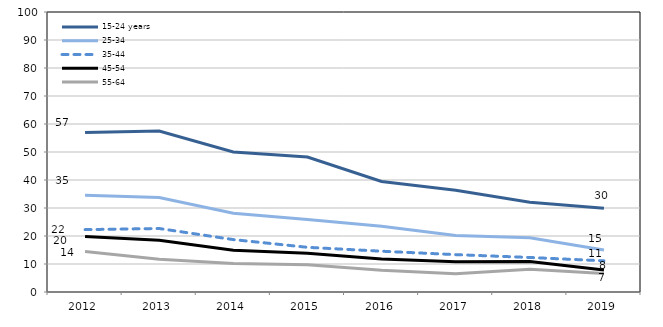
| Category | 15-24 years | 25-34  | 35-44  | 45-54  | 55-64  |
|---|---|---|---|---|---|
| 2012.0 | 56.995 | 34.562 | 22.277 | 19.78 | 14.436 |
| 2013.0 | 57.469 | 33.713 | 22.68 | 18.46 | 11.731 |
| 2014.0 | 49.988 | 28.151 | 18.717 | 14.91 | 10.163 |
| 2015.0 | 48.204 | 25.913 | 15.958 | 13.823 | 9.762 |
| 2016.0 | 39.452 | 23.518 | 14.565 | 11.783 | 7.765 |
| 2017.0 | 36.331 | 20.206 | 13.347 | 10.801 | 6.554 |
| 2018.0 | 32.017 | 19.334 | 12.335 | 10.869 | 8.105 |
| 2019.0 | 29.872 | 14.971 | 11.127 | 7.886 | 6.619 |